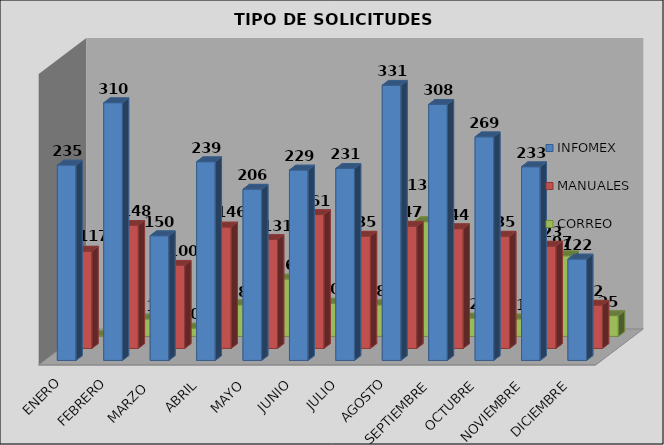
| Category | INFOMEX | MANUALES | CORREO |
|---|---|---|---|
| ENERO | 235 | 117 | 1 |
| FEBRERO | 310 | 148 | 21 |
| MARZO  | 150 | 100 | 10 |
| ABRIL | 239 | 146 | 38 |
| MAYO | 206 | 131 | 69 |
| JUNIO | 229 | 161 | 40 |
| JULIO | 231 | 135 | 38 |
| AGOSTO | 331 | 147 | 138 |
| SEPTIEMBRE | 308 | 144 | 22 |
| OCTUBRE | 269 | 135 | 21 |
| NOVIEMBRE | 233 | 123 | 97 |
| DICIEMBRE | 122 | 52 | 25 |